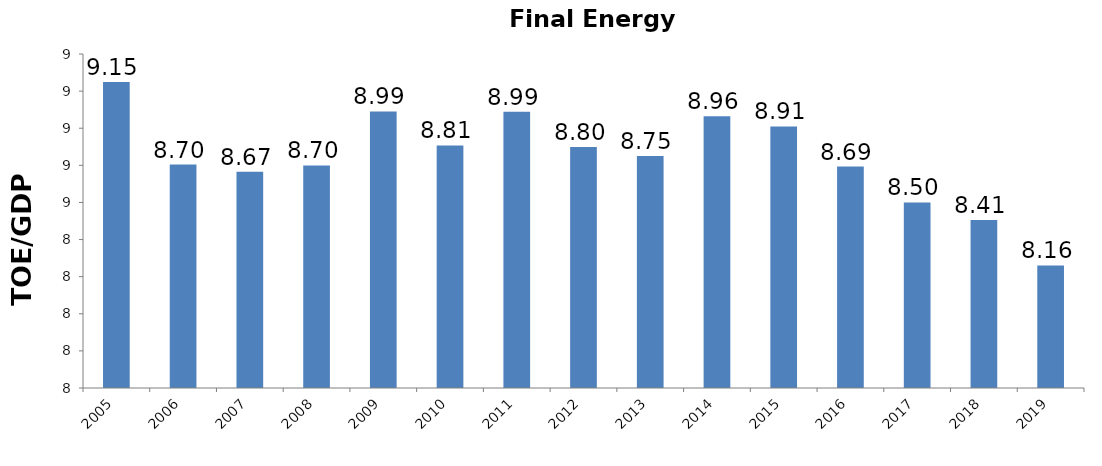
| Category | FEC : GDP (toe : M.Bahts) |
|---|---|
| 2005 | 9.15 |
| 2006 | 8.704 |
| 2007 | 8.665 |
| 2008 | 8.699 |
| 2009 | 8.991 |
| 2010 | 8.807 |
| 2011 | 8.989 |
| 2012 | 8.799 |
| 2013 | 8.751 |
| 2014 | 8.964 |
| 2015 | 8.91 |
| 2016 | 8.693 |
| 2017 | 8.5 |
| 2018 | 8.406 |
| 2019 | 8.16 |